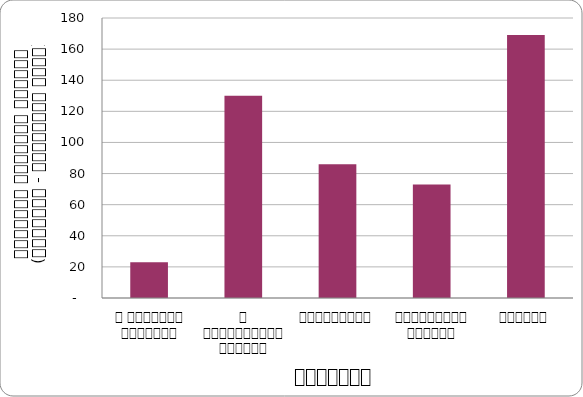
| Category | राजनीति |
|---|---|
| द हिमालयन टाइम्स् | 23 |
| द काठमाण्डौं पोस्ट् | 130 |
| कान्तिपुर | 86 |
| अन्नपूर्ण पोस्ट् | 73 |
| नागरिक | 169 |